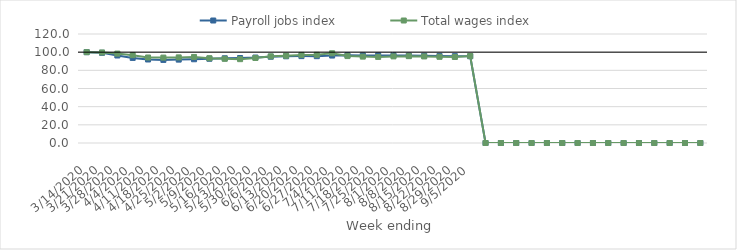
| Category | Payroll jobs index | Total wages index |
|---|---|---|
| 3/14/2020 | 100 | 100 |
| 3/21/2020 | 99.287 | 99.672 |
| 3/28/2020 | 96.324 | 98.416 |
| 4/4/2020 | 93.668 | 96.718 |
| 4/11/2020 | 91.934 | 94.131 |
| 4/18/2020 | 91.469 | 94.023 |
| 4/25/2020 | 91.796 | 94.249 |
| 5/2/2020 | 92.192 | 94.719 |
| 5/9/2020 | 92.74 | 93.349 |
| 5/16/2020 | 93.27 | 92.686 |
| 5/23/2020 | 93.57 | 92.302 |
| 5/30/2020 | 94.082 | 93.6 |
| 6/6/2020 | 94.995 | 95.373 |
| 6/13/2020 | 95.458 | 96.064 |
| 6/20/2020 | 95.654 | 96.971 |
| 6/27/2020 | 95.59 | 97.092 |
| 7/4/2020 | 96.269 | 98.79 |
| 7/11/2020 | 96.518 | 95.694 |
| 7/18/2020 | 96.375 | 95.102 |
| 7/25/2020 | 96.44 | 94.758 |
| 8/1/2020 | 96.466 | 95.35 |
| 8/8/2020 | 96.196 | 95.604 |
| 8/15/2020 | 96.048 | 95.29 |
| 8/22/2020 | 95.872 | 94.881 |
| 8/29/2020 | 95.598 | 94.692 |
| 9/5/2020 | 95.533 | 95.73 |